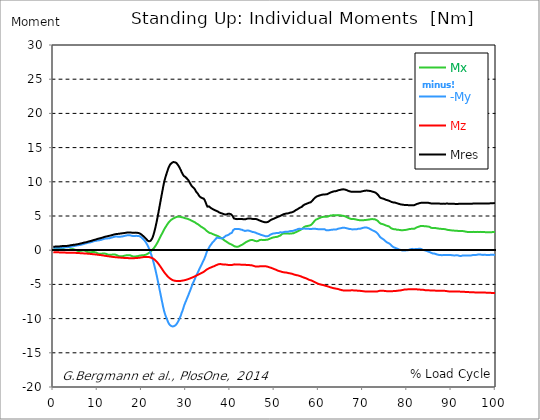
| Category |  Mx |  -My |  Mz |  Mres |
|---|---|---|---|---|
| 0.0 | 0.11 | 0.36 | -0.29 | 0.52 |
| 0.167348456675344 | 0.12 | 0.36 | -0.29 | 0.52 |
| 0.334696913350688 | 0.13 | 0.35 | -0.3 | 0.52 |
| 0.5020453700260321 | 0.15 | 0.34 | -0.3 | 0.52 |
| 0.669393826701376 | 0.17 | 0.35 | -0.3 | 0.54 |
| 0.83674228337672 | 0.17 | 0.35 | -0.3 | 0.54 |
| 1.0040907400520642 | 0.16 | 0.35 | -0.31 | 0.54 |
| 1.1621420602454444 | 0.17 | 0.34 | -0.31 | 0.54 |
| 1.3294905169207885 | 0.19 | 0.34 | -0.32 | 0.55 |
| 1.4968389735961325 | 0.21 | 0.34 | -0.32 | 0.56 |
| 1.6641874302714765 | 0.22 | 0.35 | -0.32 | 0.58 |
| 1.8315358869468206 | 0.22 | 0.35 | -0.33 | 0.58 |
| 1.9988843436221646 | 0.22 | 0.37 | -0.33 | 0.6 |
| 2.1662328002975086 | 0.19 | 0.39 | -0.34 | 0.61 |
| 2.333581256972853 | 0.15 | 0.41 | -0.34 | 0.62 |
| 2.5009297136481967 | 0.1 | 0.42 | -0.35 | 0.62 |
| 2.6682781703235405 | 0.06 | 0.42 | -0.35 | 0.61 |
| 2.8356266269988843 | 0.02 | 0.43 | -0.36 | 0.62 |
| 3.002975083674229 | 0.01 | 0.44 | -0.37 | 0.62 |
| 3.1703235403495724 | 0.01 | 0.44 | -0.37 | 0.64 |
| 3.337671997024917 | 0.03 | 0.45 | -0.38 | 0.65 |
| 3.4957233172182973 | 0.06 | 0.45 | -0.38 | 0.67 |
| 3.663071773893641 | 0.09 | 0.47 | -0.39 | 0.69 |
| 3.8304202305689854 | 0.12 | 0.48 | -0.39 | 0.71 |
| 3.997768687244329 | 0.14 | 0.5 | -0.39 | 0.73 |
| 4.165117143919673 | 0.15 | 0.53 | -0.39 | 0.75 |
| 4.332465600595017 | 0.16 | 0.56 | -0.39 | 0.77 |
| 4.499814057270361 | 0.15 | 0.58 | -0.39 | 0.78 |
| 4.667162513945706 | 0.12 | 0.6 | -0.38 | 0.79 |
| 4.834510970621049 | 0.09 | 0.63 | -0.38 | 0.8 |
| 5.001859427296393 | 0.04 | 0.65 | -0.39 | 0.82 |
| 5.169207883971737 | -0.01 | 0.68 | -0.39 | 0.83 |
| 5.336556340647081 | -0.06 | 0.7 | -0.4 | 0.86 |
| 5.503904797322425 | -0.1 | 0.71 | -0.4 | 0.87 |
| 5.671253253997769 | -0.13 | 0.73 | -0.41 | 0.9 |
| 5.82930457419115 | -0.13 | 0.74 | -0.42 | 0.92 |
| 5.996653030866494 | -0.11 | 0.76 | -0.43 | 0.95 |
| 6.164001487541838 | -0.1 | 0.79 | -0.44 | 0.97 |
| 6.331349944217181 | -0.08 | 0.81 | -0.44 | 1 |
| 6.498698400892526 | -0.06 | 0.84 | -0.45 | 1.03 |
| 6.66604685756787 | -0.05 | 0.87 | -0.46 | 1.06 |
| 6.833395314243213 | -0.06 | 0.91 | -0.46 | 1.09 |
| 7.000743770918558 | -0.06 | 0.94 | -0.47 | 1.12 |
| 7.168092227593902 | -0.1 | 0.97 | -0.48 | 1.14 |
| 7.335440684269246 | -0.13 | 1 | -0.49 | 1.15 |
| 7.50278914094459 | -0.19 | 1.03 | -0.49 | 1.18 |
| 7.6701375976199335 | -0.24 | 1.05 | -0.5 | 1.21 |
| 7.837486054295278 | -0.28 | 1.09 | -0.51 | 1.25 |
| 7.995537374488658 | -0.31 | 1.11 | -0.52 | 1.28 |
| 8.162885831164003 | -0.33 | 1.12 | -0.53 | 1.31 |
| 8.330234287839346 | -0.31 | 1.14 | -0.54 | 1.33 |
| 8.49758274451469 | -0.29 | 1.16 | -0.55 | 1.34 |
| 8.664931201190035 | -0.28 | 1.2 | -0.56 | 1.38 |
| 8.832279657865378 | -0.27 | 1.24 | -0.57 | 1.42 |
| 8.999628114540721 | -0.27 | 1.28 | -0.59 | 1.46 |
| 9.166976571216066 | -0.28 | 1.32 | -0.6 | 1.5 |
| 9.334325027891412 | -0.28 | 1.35 | -0.61 | 1.52 |
| 9.501673484566755 | -0.31 | 1.36 | -0.62 | 1.55 |
| 9.669021941242098 | -0.35 | 1.38 | -0.63 | 1.58 |
| 9.836370397917442 | -0.41 | 1.4 | -0.64 | 1.62 |
| 10.003718854592787 | -0.45 | 1.42 | -0.66 | 1.65 |
| 10.17106731126813 | -0.49 | 1.43 | -0.67 | 1.68 |
| 10.329118631461512 | -0.52 | 1.45 | -0.69 | 1.71 |
| 10.496467088136853 | -0.54 | 1.47 | -0.7 | 1.74 |
| 10.663815544812199 | -0.53 | 1.49 | -0.71 | 1.76 |
| 10.831164001487544 | -0.52 | 1.52 | -0.73 | 1.79 |
| 10.998512458162887 | -0.5 | 1.55 | -0.74 | 1.82 |
| 11.16586091483823 | -0.48 | 1.59 | -0.76 | 1.85 |
| 11.333209371513574 | -0.47 | 1.63 | -0.78 | 1.89 |
| 11.50055782818892 | -0.47 | 1.66 | -0.8 | 1.92 |
| 11.667906284864264 | -0.49 | 1.69 | -0.82 | 1.96 |
| 11.835254741539607 | -0.51 | 1.71 | -0.83 | 1.99 |
| 12.00260319821495 | -0.55 | 1.72 | -0.85 | 2.01 |
| 12.169951654890292 | -0.6 | 1.72 | -0.86 | 2.04 |
| 12.337300111565641 | -0.64 | 1.73 | -0.88 | 2.06 |
| 12.504648568240984 | -0.66 | 1.74 | -0.89 | 2.08 |
| 12.662699888434362 | -0.68 | 1.75 | -0.91 | 2.11 |
| 12.830048345109708 | -0.68 | 1.78 | -0.93 | 2.14 |
| 12.997396801785053 | -0.67 | 1.81 | -0.94 | 2.16 |
| 13.164745258460396 | -0.66 | 1.84 | -0.95 | 2.19 |
| 13.33209371513574 | -0.64 | 1.88 | -0.97 | 2.22 |
| 13.499442171811083 | -0.63 | 1.92 | -0.98 | 2.26 |
| 13.666790628486426 | -0.63 | 1.94 | -1 | 2.28 |
| 13.834139085161771 | -0.63 | 1.97 | -1.01 | 2.32 |
| 14.001487541837117 | -0.64 | 1.99 | -1.02 | 2.34 |
| 14.16883599851246 | -0.69 | 2 | -1.03 | 2.36 |
| 14.336184455187803 | -0.73 | 1.99 | -1.04 | 2.37 |
| 14.503532911863147 | -0.78 | 1.98 | -1.05 | 2.38 |
| 14.670881368538492 | -0.82 | 1.97 | -1.06 | 2.39 |
| 14.828932688731873 | -0.86 | 1.96 | -1.07 | 2.4 |
| 14.996281145407215 | -0.89 | 1.97 | -1.08 | 2.42 |
| 15.163629602082558 | -0.91 | 1.99 | -1.08 | 2.45 |
| 15.330978058757903 | -0.9 | 1.99 | -1.09 | 2.45 |
| 15.498326515433247 | -0.89 | 2 | -1.1 | 2.46 |
| 15.665674972108594 | -0.87 | 2.02 | -1.11 | 2.48 |
| 15.833023428783937 | -0.85 | 2.05 | -1.12 | 2.49 |
| 16.00037188545928 | -0.82 | 2.08 | -1.13 | 2.51 |
| 16.167720342134626 | -0.79 | 2.1 | -1.13 | 2.53 |
| 16.335068798809967 | -0.77 | 2.13 | -1.14 | 2.54 |
| 16.502417255485312 | -0.75 | 2.15 | -1.15 | 2.56 |
| 16.669765712160658 | -0.73 | 2.17 | -1.15 | 2.58 |
| 16.837114168836 | -0.72 | 2.19 | -1.16 | 2.59 |
| 17.004462625511344 | -0.72 | 2.2 | -1.16 | 2.6 |
| 17.16251394570472 | -0.72 | 2.2 | -1.16 | 2.6 |
| 17.32986240238007 | -0.74 | 2.18 | -1.16 | 2.59 |
| 17.497210859055414 | -0.78 | 2.15 | -1.16 | 2.58 |
| 17.664559315730756 | -0.83 | 2.12 | -1.16 | 2.57 |
| 17.8319077724061 | -0.87 | 2.1 | -1.16 | 2.56 |
| 17.999256229081443 | -0.91 | 2.07 | -1.16 | 2.55 |
| 18.166604685756788 | -0.94 | 2.05 | -1.16 | 2.55 |
| 18.333953142432133 | -0.93 | 2.06 | -1.16 | 2.56 |
| 18.501301599107478 | -0.92 | 2.08 | -1.15 | 2.56 |
| 18.668650055782823 | -0.9 | 2.1 | -1.15 | 2.57 |
| 18.835998512458165 | -0.89 | 2.09 | -1.14 | 2.55 |
| 19.00334696913351 | -0.87 | 2.09 | -1.13 | 2.54 |
| 19.170695425808855 | -0.84 | 2.1 | -1.12 | 2.53 |
| 19.338043882484197 | -0.82 | 2.07 | -1.11 | 2.5 |
| 19.496095202677576 | -0.8 | 2.05 | -1.09 | 2.47 |
| 19.66344365935292 | -0.77 | 1.99 | -1.08 | 2.4 |
| 19.830792116028263 | -0.75 | 1.92 | -1.06 | 2.33 |
| 19.998140572703612 | -0.75 | 1.82 | -1.04 | 2.24 |
| 20.165489029378953 | -0.74 | 1.71 | -1.03 | 2.15 |
| 20.3328374860543 | -0.74 | 1.61 | -1.01 | 2.06 |
| 20.500185942729644 | -0.72 | 1.5 | -1 | 1.96 |
| 20.667534399404985 | -0.7 | 1.37 | -1 | 1.86 |
| 20.83488285608033 | -0.67 | 1.22 | -0.99 | 1.75 |
| 21.002231312755672 | -0.64 | 1.05 | -0.98 | 1.63 |
| 21.16957976943102 | -0.58 | 0.86 | -0.98 | 1.5 |
| 21.336928226106362 | -0.52 | 0.65 | -0.98 | 1.39 |
| 21.504276682781704 | -0.45 | 0.43 | -1 | 1.32 |
| 21.67162513945705 | -0.37 | 0.18 | -1.01 | 1.3 |
| 21.82967645965043 | -0.28 | -0.1 | -1.04 | 1.33 |
| 21.997024916325774 | -0.19 | -0.4 | -1.07 | 1.39 |
| 22.16437337300112 | -0.09 | -0.71 | -1.1 | 1.51 |
| 22.33172182967646 | 0.02 | -1.06 | -1.15 | 1.71 |
| 22.499070286351806 | 0.13 | -1.42 | -1.21 | 1.97 |
| 22.666418743027148 | 0.26 | -1.82 | -1.27 | 2.31 |
| 22.833767199702496 | 0.4 | -2.23 | -1.35 | 2.69 |
| 23.00111565637784 | 0.55 | -2.67 | -1.44 | 3.12 |
| 23.168464113053183 | 0.71 | -3.12 | -1.54 | 3.59 |
| 23.335812569728528 | 0.89 | -3.61 | -1.65 | 4.09 |
| 23.50316102640387 | 1.08 | -4.11 | -1.77 | 4.63 |
| 23.670509483079215 | 1.29 | -4.64 | -1.91 | 5.21 |
| 23.83785793975456 | 1.51 | -5.15 | -2.05 | 5.77 |
| 23.995909259947936 | 1.72 | -5.7 | -2.21 | 6.36 |
| 24.163257716623285 | 1.93 | -6.23 | -2.36 | 6.95 |
| 24.330606173298627 | 2.14 | -6.77 | -2.52 | 7.55 |
| 24.49795462997397 | 2.34 | -7.29 | -2.68 | 8.12 |
| 24.665303086649313 | 2.54 | -7.8 | -2.84 | 8.69 |
| 24.83265154332466 | 2.76 | -8.32 | -3 | 9.28 |
| 25.0 | 2.97 | -8.79 | -3.16 | 9.81 |
| 25.167348456675345 | 3.16 | -9.18 | -3.3 | 10.26 |
| 25.334696913350694 | 3.34 | -9.51 | -3.44 | 10.66 |
| 25.502045370026035 | 3.51 | -9.79 | -3.57 | 11 |
| 25.669393826701377 | 3.68 | -10.06 | -3.7 | 11.34 |
| 25.836742283376722 | 3.84 | -10.34 | -3.82 | 11.68 |
| 26.004090740052067 | 4 | -10.59 | -3.93 | 11.99 |
| 26.17143919672741 | 4.13 | -10.78 | -4.02 | 12.23 |
| 26.329490516920792 | 4.25 | -10.93 | -4.11 | 12.44 |
| 26.49683897359613 | 4.36 | -11.04 | -4.19 | 12.6 |
| 26.66418743027148 | 4.45 | -11.09 | -4.26 | 12.7 |
| 26.831535886946828 | 4.53 | -11.13 | -4.32 | 12.78 |
| 26.998884343622166 | 4.6 | -11.15 | -4.38 | 12.85 |
| 27.166232800297514 | 4.66 | -11.15 | -4.41 | 12.89 |
| 27.333581256972852 | 4.71 | -11.09 | -4.45 | 12.86 |
| 27.5009297136482 | 4.76 | -11.04 | -4.47 | 12.85 |
| 27.668278170323543 | 4.81 | -10.95 | -4.49 | 12.8 |
| 27.835626626998888 | 4.86 | -10.86 | -4.5 | 12.75 |
| 28.002975083674233 | 4.89 | -10.66 | -4.51 | 12.61 |
| 28.170323540349575 | 4.91 | -10.47 | -4.52 | 12.46 |
| 28.33767199702492 | 4.91 | -10.26 | -4.52 | 12.29 |
| 28.50502045370026 | 4.9 | -10.04 | -4.51 | 12.11 |
| 28.663071773893645 | 4.88 | -9.76 | -4.5 | 11.88 |
| 28.830420230568986 | 4.87 | -9.53 | -4.48 | 11.69 |
| 28.99776868724433 | 4.83 | -9.17 | -4.47 | 11.41 |
| 29.165117143919673 | 4.81 | -8.91 | -4.45 | 11.21 |
| 29.33246560059502 | 4.78 | -8.59 | -4.43 | 11.02 |
| 29.499814057270367 | 4.74 | -8.23 | -4.41 | 10.86 |
| 29.66716251394571 | 4.7 | -7.92 | -4.39 | 10.76 |
| 29.834510970621054 | 4.68 | -7.66 | -4.36 | 10.71 |
| 30.00185942729639 | 4.65 | -7.4 | -4.33 | 10.58 |
| 30.169207883971744 | 4.63 | -7.14 | -4.29 | 10.5 |
| 30.33655634064708 | 4.59 | -6.87 | -4.26 | 10.39 |
| 30.50390479732243 | 4.55 | -6.61 | -4.23 | 10.26 |
| 30.671253253997772 | 4.5 | -6.33 | -4.19 | 10.07 |
| 30.829304574191156 | 4.46 | -6.06 | -4.15 | 9.88 |
| 30.996653030866494 | 4.41 | -5.78 | -4.1 | 9.7 |
| 31.164001487541842 | 4.35 | -5.49 | -4.06 | 9.49 |
| 31.331349944217187 | 4.29 | -5.2 | -4.01 | 9.36 |
| 31.498698400892525 | 4.23 | -4.91 | -3.97 | 9.23 |
| 31.666046857567874 | 4.18 | -4.66 | -3.92 | 9.12 |
| 31.833395314243212 | 4.13 | -4.44 | -3.87 | 9.05 |
| 32.00074377091856 | 4.08 | -4.2 | -3.82 | 8.9 |
| 32.1680922275939 | 4 | -3.91 | -3.77 | 8.68 |
| 32.33544068426925 | 3.92 | -3.65 | -3.72 | 8.51 |
| 32.50278914094459 | 3.87 | -3.47 | -3.66 | 8.42 |
| 32.670137597619934 | 3.8 | -3.25 | -3.6 | 8.27 |
| 32.83748605429528 | 3.71 | -3.01 | -3.55 | 8.08 |
| 33.004834510970625 | 3.64 | -2.76 | -3.49 | 7.91 |
| 33.162885831164004 | 3.55 | -2.54 | -3.44 | 7.79 |
| 33.33023428783935 | 3.47 | -2.34 | -3.39 | 7.72 |
| 33.497582744514695 | 3.41 | -2.12 | -3.34 | 7.65 |
| 33.664931201190036 | 3.34 | -1.89 | -3.28 | 7.61 |
| 33.83227965786538 | 3.27 | -1.66 | -3.22 | 7.58 |
| 33.99962811454073 | 3.2 | -1.44 | -3.16 | 7.54 |
| 34.16697657121607 | 3.12 | -1.2 | -3.08 | 7.37 |
| 34.33432502789141 | 3.04 | -0.93 | -3 | 7.15 |
| 34.50167348456676 | 2.93 | -0.62 | -2.91 | 6.88 |
| 34.6690219412421 | 2.82 | -0.3 | -2.83 | 6.58 |
| 34.83637039791744 | 2.72 | -0.03 | -2.76 | 6.37 |
| 35.00371885459279 | 2.66 | 0.15 | -2.71 | 6.38 |
| 35.17106731126814 | 2.59 | 0.32 | -2.66 | 6.41 |
| 35.338415767943474 | 2.52 | 0.55 | -2.6 | 6.3 |
| 35.49646708813686 | 2.49 | 0.7 | -2.55 | 6.23 |
| 35.6638155448122 | 2.48 | 0.83 | -2.51 | 6.18 |
| 35.831164001487544 | 2.42 | 0.99 | -2.46 | 6.08 |
| 35.998512458162885 | 2.37 | 1.15 | -2.42 | 5.98 |
| 36.165860914838234 | 2.33 | 1.25 | -2.38 | 5.97 |
| 36.333209371513576 | 2.28 | 1.36 | -2.34 | 5.95 |
| 36.50055782818892 | 2.23 | 1.5 | -2.29 | 5.85 |
| 36.667906284864266 | 2.19 | 1.62 | -2.24 | 5.79 |
| 36.83525474153961 | 2.15 | 1.74 | -2.19 | 5.76 |
| 37.002603198214956 | 2.12 | 1.84 | -2.14 | 5.72 |
| 37.1699516548903 | 2.07 | 1.84 | -2.1 | 5.66 |
| 37.337300111565646 | 2.02 | 1.8 | -2.05 | 5.58 |
| 37.50464856824098 | 1.96 | 1.77 | -2.03 | 5.52 |
| 37.66269988843437 | 1.9 | 1.75 | -2.03 | 5.47 |
| 37.83004834510971 | 1.84 | 1.73 | -2.03 | 5.43 |
| 37.99739680178505 | 1.77 | 1.74 | -2.04 | 5.41 |
| 38.16474525846039 | 1.69 | 1.73 | -2.06 | 5.37 |
| 38.33209371513574 | 1.61 | 1.76 | -2.09 | 5.33 |
| 38.49944217181109 | 1.52 | 1.83 | -2.11 | 5.28 |
| 38.666790628486424 | 1.44 | 1.93 | -2.11 | 5.23 |
| 38.83413908516178 | 1.37 | 2.04 | -2.1 | 5.22 |
| 39.001487541837115 | 1.3 | 2.11 | -2.1 | 5.23 |
| 39.16883599851246 | 1.22 | 2.13 | -2.12 | 5.24 |
| 39.336184455187805 | 1.16 | 2.18 | -2.13 | 5.28 |
| 39.503532911863154 | 1.09 | 2.22 | -2.16 | 5.33 |
| 39.670881368538495 | 1.01 | 2.28 | -2.18 | 5.35 |
| 39.83822982521384 | 0.96 | 2.36 | -2.19 | 5.33 |
| 39.996281145407224 | 0.91 | 2.45 | -2.18 | 5.29 |
| 40.163629602082565 | 0.86 | 2.5 | -2.18 | 5.25 |
| 40.33097805875791 | 0.81 | 2.53 | -2.17 | 5.19 |
| 40.498326515433256 | 0.77 | 2.71 | -2.16 | 5.05 |
| 40.6656749721086 | 0.68 | 2.94 | -2.11 | 4.81 |
| 40.83302342878393 | 0.6 | 3.08 | -2.07 | 4.64 |
| 41.00037188545929 | 0.56 | 3.09 | -2.07 | 4.59 |
| 41.16772034213463 | 0.54 | 3.09 | -2.09 | 4.58 |
| 41.33506879880997 | 0.51 | 3.09 | -2.09 | 4.56 |
| 41.50241725548531 | 0.48 | 3.1 | -2.09 | 4.54 |
| 41.66976571216066 | 0.5 | 3.09 | -2.09 | 4.53 |
| 41.837114168836 | 0.52 | 3.08 | -2.1 | 4.55 |
| 42.004462625511344 | 0.57 | 3.09 | -2.1 | 4.56 |
| 42.17181108218669 | 0.63 | 3.07 | -2.1 | 4.57 |
| 42.32986240238007 | 0.7 | 3.03 | -2.11 | 4.57 |
| 42.497210859055414 | 0.72 | 3.02 | -2.11 | 4.57 |
| 42.66455931573076 | 0.79 | 2.98 | -2.12 | 4.55 |
| 42.831907772406105 | 0.86 | 2.94 | -2.12 | 4.54 |
| 42.999256229081446 | 0.93 | 2.89 | -2.12 | 4.52 |
| 43.16660468575679 | 1.01 | 2.85 | -2.13 | 4.51 |
| 43.33395314243214 | 1.09 | 2.81 | -2.14 | 4.51 |
| 43.50130159910748 | 1.16 | 2.83 | -2.15 | 4.54 |
| 43.66865005578282 | 1.22 | 2.86 | -2.15 | 4.57 |
| 43.83599851245817 | 1.28 | 2.88 | -2.16 | 4.61 |
| 44.00334696913351 | 1.33 | 2.89 | -2.17 | 4.64 |
| 44.17069542580886 | 1.38 | 2.87 | -2.17 | 4.64 |
| 44.3380438824842 | 1.42 | 2.83 | -2.18 | 4.63 |
| 44.49609520267758 | 1.46 | 2.8 | -2.19 | 4.64 |
| 44.66344365935292 | 1.49 | 2.76 | -2.2 | 4.63 |
| 44.83079211602827 | 1.49 | 2.71 | -2.21 | 4.6 |
| 44.99814057270361 | 1.5 | 2.67 | -2.23 | 4.57 |
| 45.16548902937895 | 1.48 | 2.65 | -2.25 | 4.55 |
| 45.332837486054295 | 1.42 | 2.64 | -2.3 | 4.54 |
| 45.500185942729644 | 1.37 | 2.62 | -2.35 | 4.55 |
| 45.66753439940499 | 1.34 | 2.58 | -2.38 | 4.56 |
| 45.83488285608033 | 1.31 | 2.52 | -2.39 | 4.55 |
| 46.00223131275568 | 1.31 | 2.47 | -2.4 | 4.51 |
| 46.16957976943102 | 1.31 | 2.44 | -2.39 | 4.49 |
| 46.336928226106366 | 1.36 | 2.4 | -2.38 | 4.44 |
| 46.50427668278171 | 1.43 | 2.36 | -2.37 | 4.38 |
| 46.671625139457056 | 1.49 | 2.32 | -2.36 | 4.34 |
| 46.829676459650436 | 1.52 | 2.28 | -2.35 | 4.29 |
| 46.99702491632577 | 1.52 | 2.23 | -2.34 | 4.24 |
| 47.16437337300112 | 1.49 | 2.22 | -2.33 | 4.21 |
| 47.33172182967646 | 1.49 | 2.18 | -2.33 | 4.17 |
| 47.49907028635181 | 1.49 | 2.14 | -2.33 | 4.14 |
| 47.66641874302716 | 1.49 | 2.1 | -2.33 | 4.11 |
| 47.83376719970249 | 1.5 | 2.06 | -2.34 | 4.08 |
| 48.001115656377834 | 1.51 | 2.03 | -2.35 | 4.06 |
| 48.16846411305319 | 1.52 | 2.02 | -2.37 | 4.07 |
| 48.33581256972853 | 1.52 | 2.03 | -2.39 | 4.09 |
| 48.50316102640387 | 1.56 | 2.05 | -2.42 | 4.13 |
| 48.67050948307921 | 1.6 | 2.09 | -2.46 | 4.18 |
| 48.837857939754564 | 1.65 | 2.17 | -2.49 | 4.26 |
| 49.005206396429905 | 1.7 | 2.25 | -2.53 | 4.34 |
| 49.163257716623285 | 1.75 | 2.33 | -2.56 | 4.43 |
| 49.33060617329863 | 1.78 | 2.36 | -2.6 | 4.48 |
| 49.49795462997397 | 1.81 | 2.38 | -2.65 | 4.52 |
| 49.66530308664932 | 1.86 | 2.43 | -2.69 | 4.56 |
| 49.832651543324666 | 1.89 | 2.45 | -2.73 | 4.6 |
| 50.0 | 1.9 | 2.46 | -2.77 | 4.65 |
| 50.16734845667534 | 1.93 | 2.49 | -2.81 | 4.7 |
| 50.33469691335069 | 1.93 | 2.5 | -2.86 | 4.75 |
| 50.50204537002604 | 1.94 | 2.5 | -2.91 | 4.8 |
| 50.66939382670139 | 1.97 | 2.51 | -2.96 | 4.85 |
| 50.836742283376715 | 2.03 | 2.53 | -3 | 4.89 |
| 51.00409074005207 | 2.07 | 2.52 | -3.04 | 4.93 |
| 51.17143919672741 | 2.11 | 2.58 | -3.07 | 4.97 |
| 51.32949051692079 | 2.15 | 2.63 | -3.1 | 5.02 |
| 51.496838973596134 | 2.26 | 2.58 | -3.14 | 5.08 |
| 51.66418743027148 | 2.36 | 2.58 | -3.17 | 5.16 |
| 51.831535886946824 | 2.4 | 2.6 | -3.2 | 5.2 |
| 51.99888434362217 | 2.43 | 2.63 | -3.22 | 5.24 |
| 52.16623280029752 | 2.44 | 2.67 | -3.23 | 5.28 |
| 52.33358125697285 | 2.45 | 2.69 | -3.25 | 5.31 |
| 52.5009297136482 | 2.45 | 2.72 | -3.26 | 5.34 |
| 52.668278170323546 | 2.44 | 2.71 | -3.27 | 5.36 |
| 52.835626626998895 | 2.43 | 2.69 | -3.29 | 5.37 |
| 53.00297508367424 | 2.43 | 2.69 | -3.32 | 5.38 |
| 53.17032354034958 | 2.42 | 2.71 | -3.34 | 5.4 |
| 53.33767199702492 | 2.42 | 2.76 | -3.37 | 5.45 |
| 53.50502045370027 | 2.43 | 2.79 | -3.38 | 5.48 |
| 53.663071773893655 | 2.44 | 2.8 | -3.4 | 5.5 |
| 53.83042023056899 | 2.45 | 2.8 | -3.43 | 5.52 |
| 53.99776868724433 | 2.46 | 2.81 | -3.45 | 5.55 |
| 54.16511714391967 | 2.47 | 2.82 | -3.49 | 5.59 |
| 54.33246560059503 | 2.49 | 2.85 | -3.54 | 5.64 |
| 54.49981405727037 | 2.53 | 2.89 | -3.58 | 5.71 |
| 54.667162513945705 | 2.59 | 2.95 | -3.6 | 5.8 |
| 54.834510970621054 | 2.65 | 2.99 | -3.62 | 5.87 |
| 55.0018594272964 | 2.69 | 3 | -3.65 | 5.92 |
| 55.169207883971744 | 2.74 | 3.03 | -3.67 | 5.97 |
| 55.336556340647086 | 2.79 | 3.1 | -3.69 | 6.06 |
| 55.50390479732243 | 2.84 | 3.13 | -3.72 | 6.12 |
| 55.671253253997776 | 2.9 | 3.15 | -3.76 | 6.19 |
| 55.83860171067312 | 2.96 | 3.13 | -3.8 | 6.24 |
| 55.9966530308665 | 3.02 | 3.09 | -3.83 | 6.27 |
| 56.16400148754184 | 3.1 | 3.08 | -3.88 | 6.34 |
| 56.33134994421718 | 3.18 | 3.13 | -3.93 | 6.44 |
| 56.498698400892536 | 3.28 | 3.16 | -3.97 | 6.55 |
| 56.66604685756788 | 3.38 | 3.17 | -4.01 | 6.64 |
| 56.83339531424321 | 3.44 | 3.14 | -4.04 | 6.68 |
| 57.00074377091856 | 3.49 | 3.14 | -4.08 | 6.73 |
| 57.16809222759391 | 3.52 | 3.14 | -4.12 | 6.77 |
| 57.33544068426925 | 3.53 | 3.13 | -4.17 | 6.82 |
| 57.5027891409446 | 3.53 | 3.13 | -4.24 | 6.86 |
| 57.670137597619934 | 3.57 | 3.14 | -4.28 | 6.92 |
| 57.83748605429528 | 3.59 | 3.11 | -4.32 | 6.94 |
| 58.004834510970625 | 3.61 | 3.09 | -4.37 | 6.96 |
| 58.16288583116401 | 3.64 | 3.09 | -4.4 | 7.01 |
| 58.330234287839346 | 3.73 | 3.09 | -4.42 | 7.08 |
| 58.497582744514695 | 3.85 | 3.12 | -4.47 | 7.2 |
| 58.66493120119004 | 3.97 | 3.15 | -4.53 | 7.33 |
| 58.832279657865385 | 4.1 | 3.16 | -4.58 | 7.45 |
| 58.999628114540734 | 4.23 | 3.15 | -4.63 | 7.57 |
| 59.16697657121607 | 4.34 | 3.15 | -4.69 | 7.68 |
| 59.33432502789142 | 4.45 | 3.12 | -4.75 | 7.78 |
| 59.50167348456676 | 4.5 | 3.1 | -4.8 | 7.83 |
| 59.66902194124211 | 4.55 | 3.09 | -4.85 | 7.88 |
| 59.83637039791745 | 4.6 | 3.07 | -4.89 | 7.93 |
| 60.00371885459278 | 4.65 | 3.05 | -4.94 | 7.97 |
| 60.17106731126813 | 4.69 | 3.04 | -4.97 | 8 |
| 60.33841576794349 | 4.74 | 3.05 | -5 | 8.04 |
| 60.49646708813685 | 4.81 | 3.05 | -5.03 | 8.07 |
| 60.6638155448122 | 4.84 | 3.06 | -5.05 | 8.1 |
| 60.831164001487544 | 4.86 | 3.07 | -5.07 | 8.12 |
| 60.99851245816289 | 4.87 | 3.08 | -5.09 | 8.14 |
| 61.16586091483824 | 4.89 | 3.07 | -5.12 | 8.16 |
| 61.333209371513576 | 4.9 | 3.06 | -5.16 | 8.18 |
| 61.50055782818892 | 4.89 | 3.01 | -5.19 | 8.16 |
| 61.667906284864266 | 4.89 | 2.93 | -5.22 | 8.15 |
| 61.835254741539615 | 4.9 | 2.9 | -5.25 | 8.17 |
| 62.002603198214956 | 4.91 | 2.9 | -5.28 | 8.2 |
| 62.16995165489029 | 4.96 | 2.92 | -5.32 | 8.27 |
| 62.33730011156564 | 4.99 | 2.92 | -5.36 | 8.32 |
| 62.504648568240995 | 5.02 | 2.94 | -5.4 | 8.38 |
| 62.67199702491633 | 5.07 | 2.97 | -5.43 | 8.45 |
| 62.83004834510971 | 5.08 | 2.98 | -5.46 | 8.48 |
| 62.99739680178505 | 5.09 | 2.98 | -5.49 | 8.51 |
| 63.1647452584604 | 5.11 | 2.99 | -5.52 | 8.55 |
| 63.33209371513575 | 5.13 | 3.03 | -5.55 | 8.59 |
| 63.4994421718111 | 5.13 | 3.04 | -5.58 | 8.62 |
| 63.666790628486424 | 5.12 | 3.04 | -5.59 | 8.63 |
| 63.83413908516177 | 5.1 | 3.03 | -5.61 | 8.63 |
| 64.00148754183712 | 5.1 | 3.04 | -5.63 | 8.65 |
| 64.16883599851248 | 5.11 | 3.08 | -5.65 | 8.69 |
| 64.3361844551878 | 5.13 | 3.13 | -5.67 | 8.74 |
| 64.50353291186315 | 5.13 | 3.15 | -5.71 | 8.78 |
| 64.6708813685385 | 5.12 | 3.18 | -5.74 | 8.8 |
| 64.83822982521384 | 5.1 | 3.2 | -5.77 | 8.82 |
| 65.00557828188919 | 5.09 | 3.22 | -5.8 | 8.85 |
| 65.16362960208257 | 5.07 | 3.25 | -5.83 | 8.87 |
| 65.3309780587579 | 5.04 | 3.27 | -5.86 | 8.89 |
| 65.49832651543326 | 5.02 | 3.28 | -5.88 | 8.9 |
| 65.6656749721086 | 5.01 | 3.28 | -5.89 | 8.89 |
| 65.83302342878395 | 4.97 | 3.27 | -5.89 | 8.88 |
| 66.00037188545929 | 4.94 | 3.26 | -5.9 | 8.86 |
| 66.16772034213463 | 4.89 | 3.22 | -5.9 | 8.82 |
| 66.33506879880998 | 4.84 | 3.2 | -5.9 | 8.78 |
| 66.50241725548531 | 4.78 | 3.17 | -5.9 | 8.73 |
| 66.66976571216065 | 4.73 | 3.15 | -5.9 | 8.69 |
| 66.83711416883601 | 4.68 | 3.11 | -5.9 | 8.64 |
| 67.00446262551135 | 4.64 | 3.09 | -5.89 | 8.6 |
| 67.1718110821867 | 4.6 | 3.09 | -5.87 | 8.57 |
| 67.32986240238007 | 4.57 | 3.08 | -5.87 | 8.56 |
| 67.49721085905541 | 4.57 | 3.06 | -5.87 | 8.55 |
| 67.66455931573076 | 4.56 | 3.04 | -5.87 | 8.54 |
| 67.83190777240611 | 4.55 | 3.04 | -5.87 | 8.54 |
| 67.99925622908145 | 4.55 | 3.05 | -5.88 | 8.54 |
| 68.16660468575678 | 4.53 | 3.06 | -5.89 | 8.55 |
| 68.33395314243214 | 4.51 | 3.07 | -5.89 | 8.54 |
| 68.50130159910749 | 4.48 | 3.07 | -5.9 | 8.54 |
| 68.66865005578282 | 4.45 | 3.08 | -5.91 | 8.54 |
| 68.83599851245816 | 4.43 | 3.12 | -5.93 | 8.55 |
| 69.00334696913352 | 4.41 | 3.15 | -5.94 | 8.57 |
| 69.17069542580886 | 4.4 | 3.14 | -5.94 | 8.56 |
| 69.3380438824842 | 4.38 | 3.13 | -5.94 | 8.54 |
| 69.50539233915956 | 4.37 | 3.16 | -5.96 | 8.56 |
| 69.66344365935292 | 4.38 | 3.2 | -5.97 | 8.59 |
| 69.83079211602826 | 4.37 | 3.24 | -5.98 | 8.61 |
| 69.99814057270362 | 4.38 | 3.27 | -5.99 | 8.63 |
| 70.16548902937896 | 4.39 | 3.29 | -6 | 8.66 |
| 70.33283748605429 | 4.4 | 3.31 | -6.02 | 8.68 |
| 70.50018594272964 | 4.4 | 3.33 | -6.02 | 8.7 |
| 70.667534399405 | 4.42 | 3.32 | -6.03 | 8.71 |
| 70.83488285608033 | 4.43 | 3.31 | -6.03 | 8.72 |
| 71.00223131275568 | 4.45 | 3.29 | -6.02 | 8.72 |
| 71.16957976943102 | 4.46 | 3.24 | -6.03 | 8.7 |
| 71.33692822610637 | 4.48 | 3.2 | -6.03 | 8.69 |
| 71.50427668278171 | 4.5 | 3.14 | -6.03 | 8.67 |
| 71.67162513945706 | 4.52 | 3.08 | -6.02 | 8.65 |
| 71.8389735961324 | 4.54 | 3.02 | -6.02 | 8.63 |
| 71.99702491632577 | 4.55 | 2.96 | -6.02 | 8.6 |
| 72.16437337300113 | 4.54 | 2.9 | -6.02 | 8.56 |
| 72.33172182967647 | 4.54 | 2.85 | -6.02 | 8.54 |
| 72.49907028635181 | 4.53 | 2.8 | -6.02 | 8.5 |
| 72.66641874302715 | 4.52 | 2.75 | -6.03 | 8.47 |
| 72.8337671997025 | 4.48 | 2.7 | -6.03 | 8.42 |
| 73.00111565637783 | 4.42 | 2.63 | -6.02 | 8.33 |
| 73.16846411305319 | 4.35 | 2.54 | -6.02 | 8.25 |
| 73.33581256972853 | 4.3 | 2.42 | -6.02 | 8.16 |
| 73.50316102640387 | 4.19 | 2.28 | -5.99 | 8.02 |
| 73.67050948307921 | 4.06 | 2.12 | -5.95 | 7.87 |
| 73.83785793975457 | 3.94 | 1.96 | -5.92 | 7.71 |
| 74.00520639642991 | 3.88 | 1.85 | -5.92 | 7.64 |
| 74.16325771662328 | 3.85 | 1.77 | -5.92 | 7.61 |
| 74.33060617329863 | 3.83 | 1.71 | -5.92 | 7.59 |
| 74.49795462997398 | 3.8 | 1.64 | -5.93 | 7.55 |
| 74.66530308664932 | 3.77 | 1.57 | -5.94 | 7.52 |
| 74.83265154332466 | 3.72 | 1.49 | -5.95 | 7.48 |
| 75.00000000000001 | 3.67 | 1.38 | -5.96 | 7.42 |
| 75.16734845667534 | 3.62 | 1.27 | -5.97 | 7.37 |
| 75.3346969133507 | 3.58 | 1.19 | -5.99 | 7.34 |
| 75.50204537002605 | 3.54 | 1.12 | -6 | 7.31 |
| 75.66939382670138 | 3.52 | 1.08 | -6 | 7.29 |
| 75.83674228337672 | 3.49 | 1.02 | -6 | 7.25 |
| 76.00409074005208 | 3.44 | 0.95 | -6 | 7.21 |
| 76.17143919672742 | 3.36 | 0.87 | -6.01 | 7.15 |
| 76.33878765340276 | 3.22 | 0.73 | -6 | 7.07 |
| 76.49683897359614 | 3.16 | 0.64 | -6 | 7.04 |
| 76.66418743027148 | 3.13 | 0.57 | -5.99 | 7.02 |
| 76.83153588694682 | 3.09 | 0.48 | -5.98 | 6.99 |
| 76.99888434362218 | 3.07 | 0.4 | -5.97 | 6.97 |
| 77.16623280029752 | 3.08 | 0.37 | -5.97 | 6.97 |
| 77.33358125697285 | 3.07 | 0.33 | -5.96 | 6.96 |
| 77.5009297136482 | 3.02 | 0.29 | -5.94 | 6.91 |
| 77.66827817032356 | 2.99 | 0.23 | -5.94 | 6.87 |
| 77.83562662699889 | 2.96 | 0.2 | -5.93 | 6.83 |
| 78.00297508367423 | 2.99 | 0.14 | -5.91 | 6.81 |
| 78.17032354034959 | 2.97 | 0.09 | -5.9 | 6.77 |
| 78.33767199702493 | 2.95 | 0.06 | -5.89 | 6.74 |
| 78.50502045370027 | 2.93 | 0.04 | -5.88 | 6.7 |
| 78.67236891037561 | 2.92 | 0.02 | -5.86 | 6.68 |
| 78.83042023056899 | 2.92 | -0.03 | -5.83 | 6.67 |
| 78.99776868724433 | 2.93 | -0.05 | -5.81 | 6.67 |
| 79.16511714391969 | 2.94 | -0.05 | -5.79 | 6.64 |
| 79.33246560059503 | 2.94 | -0.05 | -5.76 | 6.62 |
| 79.49981405727036 | 2.96 | -0.04 | -5.75 | 6.6 |
| 79.66716251394571 | 2.97 | -0.03 | -5.74 | 6.59 |
| 79.83451097062107 | 2.98 | -0.02 | -5.74 | 6.59 |
| 80.00185942729641 | 3.01 | -0.01 | -5.73 | 6.59 |
| 80.16920788397174 | 3.05 | -0.01 | -5.72 | 6.59 |
| 80.33655634064709 | 3.07 | 0.04 | -5.72 | 6.58 |
| 80.50390479732243 | 3.08 | 0.09 | -5.71 | 6.57 |
| 80.67125325399778 | 3.1 | 0.12 | -5.71 | 6.57 |
| 80.83860171067312 | 3.13 | 0.15 | -5.7 | 6.57 |
| 80.99665303086651 | 3.13 | 0.19 | -5.7 | 6.57 |
| 81.16400148754184 | 3.13 | 0.19 | -5.7 | 6.57 |
| 81.3313499442172 | 3.13 | 0.14 | -5.7 | 6.57 |
| 81.49869840089255 | 3.13 | 0.11 | -5.7 | 6.56 |
| 81.66604685756786 | 3.15 | 0.14 | -5.7 | 6.59 |
| 81.83339531424322 | 3.21 | 0.18 | -5.71 | 6.65 |
| 82.00074377091858 | 3.28 | 0.18 | -5.72 | 6.71 |
| 82.16809222759392 | 3.34 | 0.17 | -5.73 | 6.76 |
| 82.33544068426926 | 3.38 | 0.18 | -5.73 | 6.78 |
| 82.50278914094459 | 3.41 | 0.19 | -5.74 | 6.81 |
| 82.67013759761994 | 3.44 | 0.2 | -5.74 | 6.83 |
| 82.83748605429528 | 3.49 | 0.22 | -5.75 | 6.89 |
| 83.00483451097062 | 3.53 | 0.22 | -5.77 | 6.92 |
| 83.17218296764597 | 3.54 | 0.18 | -5.77 | 6.93 |
| 83.33023428783935 | 3.53 | 0.11 | -5.77 | 6.93 |
| 83.4975827445147 | 3.53 | 0.06 | -5.78 | 6.93 |
| 83.66493120119004 | 3.53 | 0.04 | -5.79 | 6.94 |
| 83.83227965786537 | 3.52 | 0 | -5.82 | 6.94 |
| 83.99962811454073 | 3.5 | -0.04 | -5.84 | 6.94 |
| 84.16697657121607 | 3.49 | -0.06 | -5.85 | 6.93 |
| 84.33432502789142 | 3.49 | -0.07 | -5.86 | 6.93 |
| 84.50167348456677 | 3.48 | -0.13 | -5.86 | 6.93 |
| 84.6690219412421 | 3.46 | -0.19 | -5.86 | 6.93 |
| 84.83637039791745 | 3.45 | -0.22 | -5.86 | 6.92 |
| 85.0037188545928 | 3.43 | -0.24 | -5.87 | 6.91 |
| 85.17106731126813 | 3.36 | -0.3 | -5.88 | 6.87 |
| 85.33841576794349 | 3.3 | -0.36 | -5.89 | 6.84 |
| 85.50576422461883 | 3.27 | -0.4 | -5.89 | 6.83 |
| 85.66381554481221 | 3.24 | -0.45 | -5.9 | 6.82 |
| 85.83116400148755 | 3.23 | -0.49 | -5.9 | 6.82 |
| 85.99851245816289 | 3.24 | -0.5 | -5.91 | 6.83 |
| 86.16586091483823 | 3.25 | -0.5 | -5.91 | 6.84 |
| 86.33320937151358 | 3.24 | -0.53 | -5.91 | 6.84 |
| 86.50055782818893 | 3.23 | -0.57 | -5.92 | 6.84 |
| 86.66790628486427 | 3.21 | -0.61 | -5.92 | 6.84 |
| 86.83525474153961 | 3.2 | -0.64 | -5.92 | 6.83 |
| 87.00260319821496 | 3.17 | -0.68 | -5.92 | 6.82 |
| 87.16995165489031 | 3.15 | -0.69 | -5.92 | 6.82 |
| 87.33730011156564 | 3.14 | -0.69 | -5.92 | 6.81 |
| 87.504648568241 | 3.13 | -0.7 | -5.92 | 6.8 |
| 87.67199702491634 | 3.12 | -0.71 | -5.92 | 6.8 |
| 87.83004834510972 | 3.1 | -0.73 | -5.92 | 6.8 |
| 87.99739680178506 | 3.1 | -0.73 | -5.93 | 6.8 |
| 88.1647452584604 | 3.1 | -0.71 | -5.94 | 6.81 |
| 88.33209371513574 | 3.09 | -0.71 | -5.94 | 6.8 |
| 88.49944217181108 | 3.07 | -0.71 | -5.95 | 6.8 |
| 88.66679062848644 | 3.06 | -0.71 | -5.95 | 6.8 |
| 88.83413908516178 | 3.04 | -0.71 | -5.96 | 6.81 |
| 89.00148754183712 | 2.99 | -0.71 | -5.99 | 6.81 |
| 89.16883599851246 | 2.97 | -0.69 | -6.01 | 6.81 |
| 89.33618445518782 | 2.95 | -0.68 | -6.02 | 6.8 |
| 89.50353291186315 | 2.94 | -0.69 | -6.02 | 6.8 |
| 89.6708813685385 | 2.93 | -0.7 | -6.02 | 6.79 |
| 89.83822982521386 | 2.92 | -0.71 | -6.02 | 6.78 |
| 90.00557828188919 | 2.9 | -0.71 | -6.02 | 6.78 |
| 90.16362960208257 | 2.88 | -0.73 | -6.02 | 6.78 |
| 90.3309780587579 | 2.87 | -0.75 | -6.02 | 6.78 |
| 90.49832651543326 | 2.87 | -0.76 | -6.02 | 6.78 |
| 90.66567497210859 | 2.86 | -0.77 | -6.02 | 6.77 |
| 90.83302342878395 | 2.85 | -0.76 | -6.03 | 6.77 |
| 91.00037188545929 | 2.84 | -0.75 | -6.03 | 6.77 |
| 91.16772034213463 | 2.84 | -0.74 | -6.03 | 6.77 |
| 91.33506879880998 | 2.83 | -0.74 | -6.04 | 6.77 |
| 91.50241725548533 | 2.82 | -0.76 | -6.04 | 6.77 |
| 91.66976571216065 | 2.81 | -0.8 | -6.04 | 6.77 |
| 91.83711416883601 | 2.8 | -0.83 | -6.05 | 6.78 |
| 92.00446262551137 | 2.8 | -0.85 | -6.06 | 6.79 |
| 92.1718110821867 | 2.8 | -0.85 | -6.06 | 6.8 |
| 92.33915953886203 | 2.81 | -0.82 | -6.07 | 6.8 |
| 92.49721085905541 | 2.8 | -0.78 | -6.08 | 6.8 |
| 92.66455931573077 | 2.79 | -0.76 | -6.08 | 6.8 |
| 92.83190777240611 | 2.77 | -0.77 | -6.09 | 6.8 |
| 92.99925622908145 | 2.75 | -0.78 | -6.09 | 6.8 |
| 93.1666046857568 | 2.72 | -0.78 | -6.1 | 6.79 |
| 93.33395314243214 | 2.7 | -0.78 | -6.11 | 6.79 |
| 93.50130159910749 | 2.69 | -0.78 | -6.11 | 6.79 |
| 93.66865005578283 | 2.67 | -0.78 | -6.12 | 6.79 |
| 93.83599851245818 | 2.66 | -0.78 | -6.12 | 6.79 |
| 94.00334696913353 | 2.66 | -0.78 | -6.13 | 6.79 |
| 94.17069542580886 | 2.65 | -0.78 | -6.13 | 6.79 |
| 94.3380438824842 | 2.65 | -0.77 | -6.14 | 6.8 |
| 94.50539233915954 | 2.66 | -0.76 | -6.14 | 6.8 |
| 94.66344365935292 | 2.67 | -0.72 | -6.15 | 6.8 |
| 94.83079211602828 | 2.68 | -0.71 | -6.15 | 6.81 |
| 94.99814057270362 | 2.68 | -0.71 | -6.16 | 6.82 |
| 95.16548902937897 | 2.68 | -0.72 | -6.17 | 6.82 |
| 95.33283748605432 | 2.67 | -0.72 | -6.17 | 6.83 |
| 95.50018594272963 | 2.67 | -0.71 | -6.18 | 6.83 |
| 95.66753439940499 | 2.67 | -0.69 | -6.18 | 6.83 |
| 95.83488285608034 | 2.67 | -0.66 | -6.19 | 6.83 |
| 96.00223131275567 | 2.68 | -0.64 | -6.19 | 6.84 |
| 96.16957976943102 | 2.68 | -0.62 | -6.19 | 6.84 |
| 96.33692822610638 | 2.67 | -0.6 | -6.2 | 6.84 |
| 96.50427668278171 | 2.67 | -0.62 | -6.19 | 6.84 |
| 96.67162513945706 | 2.68 | -0.64 | -6.18 | 6.83 |
| 96.8389735961324 | 2.66 | -0.67 | -6.18 | 6.83 |
| 96.99702491632577 | 2.65 | -0.68 | -6.19 | 6.83 |
| 97.16437337300111 | 2.64 | -0.69 | -6.2 | 6.83 |
| 97.33172182967647 | 2.65 | -0.65 | -6.2 | 6.84 |
| 97.49907028635181 | 2.64 | -0.66 | -6.21 | 6.83 |
| 97.66641874302715 | 2.64 | -0.7 | -6.2 | 6.84 |
| 97.8337671997025 | 2.64 | -0.69 | -6.21 | 6.84 |
| 98.00111565637785 | 2.63 | -0.69 | -6.21 | 6.84 |
| 98.16846411305319 | 2.63 | -0.71 | -6.21 | 6.84 |
| 98.33581256972855 | 2.62 | -0.72 | -6.21 | 6.84 |
| 98.50316102640389 | 2.62 | -0.72 | -6.21 | 6.84 |
| 98.67050948307921 | 2.62 | -0.7 | -6.22 | 6.85 |
| 98.83785793975456 | 2.63 | -0.67 | -6.23 | 6.85 |
| 99.0052063964299 | 2.63 | -0.67 | -6.24 | 6.86 |
| 99.17255485310525 | 2.63 | -0.67 | -6.24 | 6.87 |
| 99.33060617329863 | 2.65 | -0.68 | -6.24 | 6.88 |
| 99.49795462997399 | 2.65 | -0.67 | -6.25 | 6.88 |
| 99.66530308664933 | 2.65 | -0.69 | -6.26 | 6.89 |
| 99.83265154332467 | 2.65 | -0.71 | -6.26 | 6.89 |
| 100.0 | 2.65 | -0.71 | -6.26 | 6.9 |